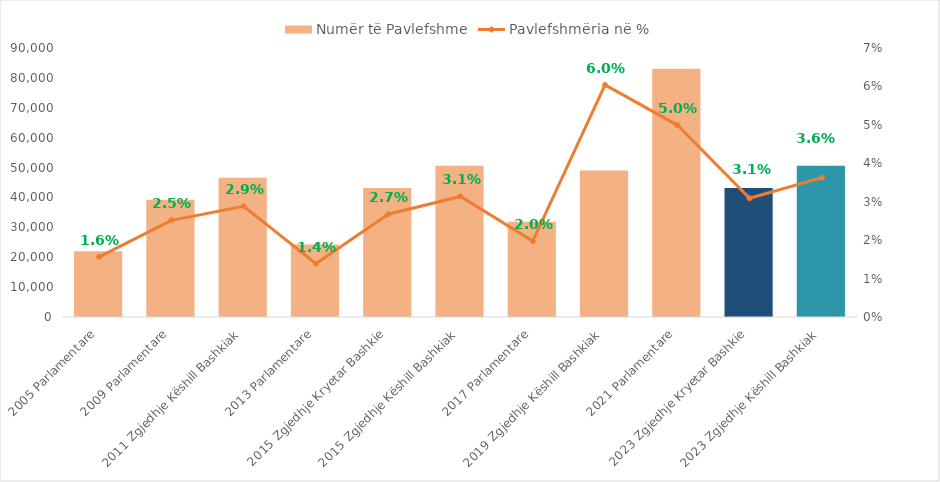
| Category | Numër të Pavlefshme |
|---|---|
| 2005 Parlamentare | 21973 |
| 2009 Parlamentare | 39198 |
| 2011 Zgjedhje Këshill Bashkiak | 46615 |
| 2013 Parlamentare | 24279 |
| 2015 Zgjedhje Kryetar Bashkie | 43127 |
| 2015 Zgjedhje Këshill Bashkiak | 50613 |
| 2017 Parlamentare | 31898 |
| 2019 Zgjedhje Këshill Bashkiak | 49018 |
| 2021 Parlamentare | 83028 |
| 2023 Zgjedhje Kryetar Bashkie | 43127 |
| 2023 Zgjedhje Këshill Bashkiak | 50613 |